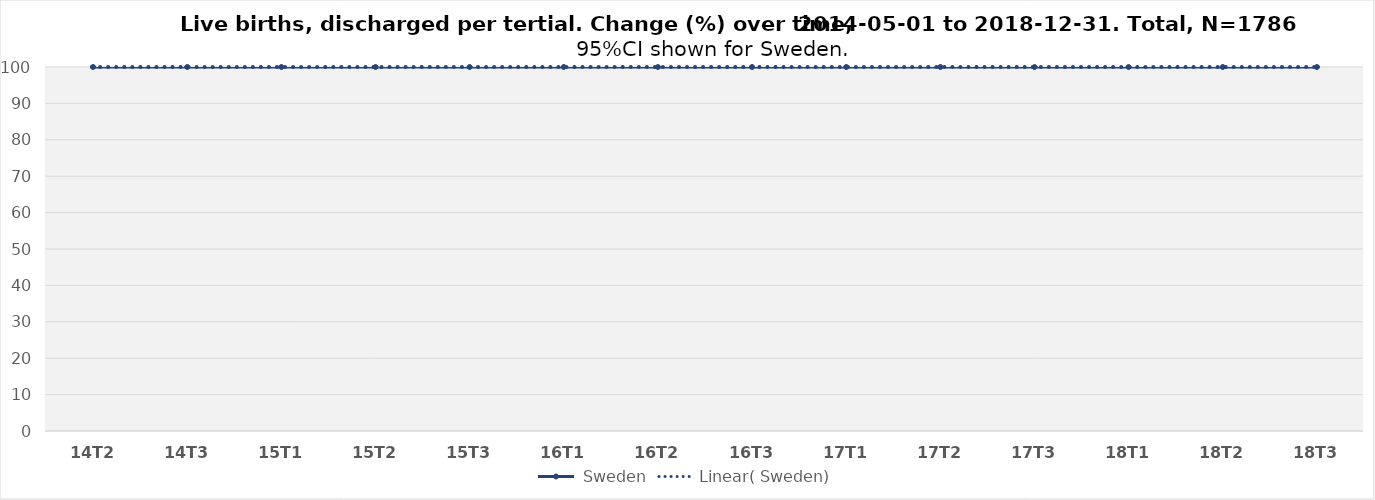
| Category |  Sweden |
|---|---|
| 14T2 | 100 |
| 14T3 | 100 |
| 15T1 | 100 |
| 15T2 | 100 |
| 15T3 | 100 |
| 16T1 | 100 |
| 16T2 | 100 |
| 16T3 | 100 |
| 17T1 | 100 |
| 17T2 | 100 |
| 17T3 | 100 |
| 18T1 | 100 |
| 18T2 | 100 |
| 18T3 | 100 |